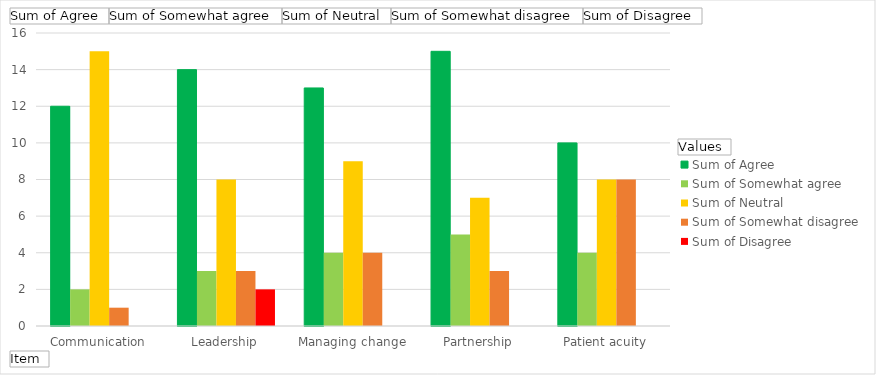
| Category | Sum of Agree | Sum of Somewhat agree | Sum of Neutral | Sum of Somewhat disagree | Sum of Disagree |
|---|---|---|---|---|---|
| Communication | 12 | 2 | 15 | 1 | 0 |
| Leadership | 14 | 3 | 8 | 3 | 2 |
| Managing change | 13 | 4 | 9 | 4 | 0 |
| Partnership | 15 | 5 | 7 | 3 | 0 |
| Patient acuity | 10 | 4 | 8 | 8 | 0 |